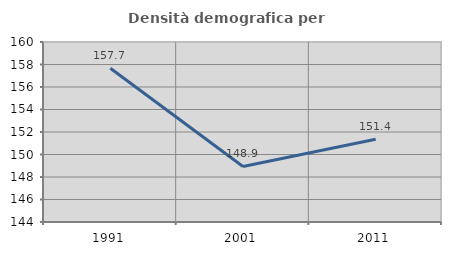
| Category | Densità demografica |
|---|---|
| 1991.0 | 157.671 |
| 2001.0 | 148.938 |
| 2011.0 | 151.362 |